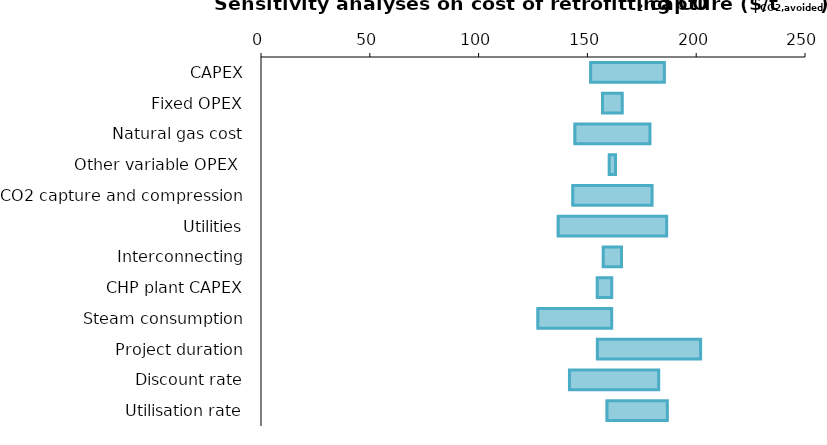
| Category | Minimum value | Increase of the parameter |
|---|---|---|
| CAPEX | 150.785 | 34.582 |
| Fixed OPEX | 156.254 | 9.81 |
| Natural gas cost | 143.57 | 35.178 |
| Other variable OPEX  | 159.392 | 3.535 |
| CO2 capture and compression | 142.601 | 37.117 |
| Utilities | 135.894 | 50.53 |
| Interconnecting | 156.635 | 9.049 |
| CHP plant CAPEX | 153.892 | 7.267 |
| Steam consumption | 126.554 | 34.606 |
| Project duration | 153.91 | 48.116 |
| Discount rate | 141.074 | 41.695 |
| Utilisation rate | 158.317 | 28.424 |